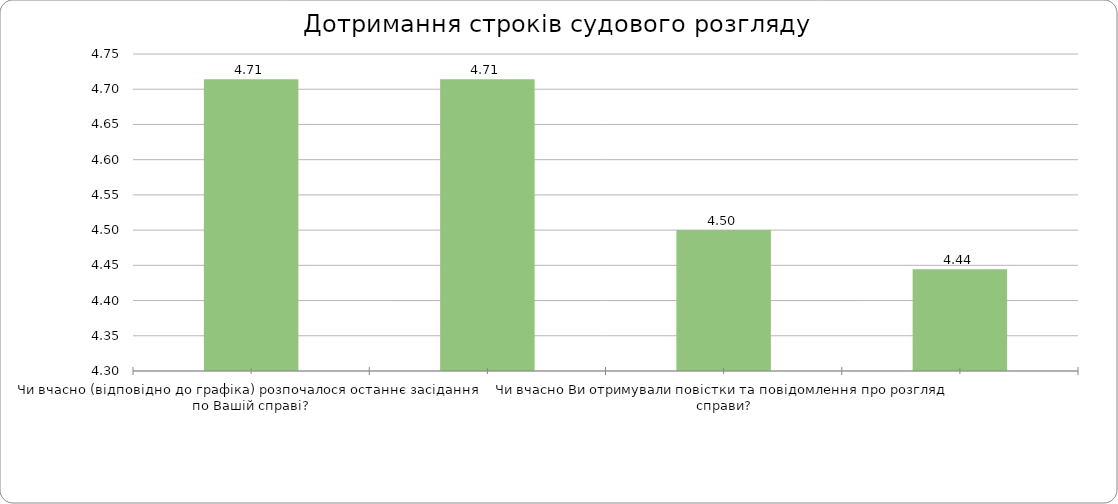
| Category | Series 0 |
|---|---|
| Чи вчасно (відповідно до графіка) розпочалося останнє засідання по Вашій справі? | 4.714 |
| Чи було враховано Ваші побажання при призначенні дня та часу засідання? | 4.714 |
| Чи вчасно Ви отримували повістки та повідомлення про розгляд справи? | 4.5 |
| Чи вважаєте Ви обґрунтованими затримки/ перенесення слухань у розгляді Вашої справи? | 4.444 |